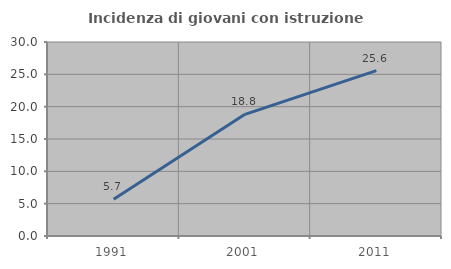
| Category | Incidenza di giovani con istruzione universitaria |
|---|---|
| 1991.0 | 5.682 |
| 2001.0 | 18.812 |
| 2011.0 | 25.581 |